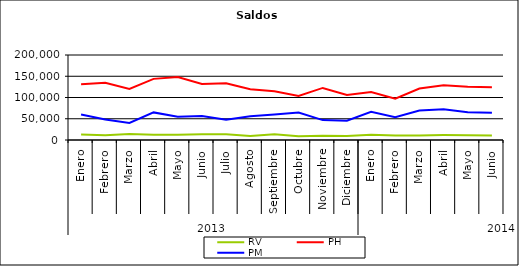
| Category | RV | PH | PM |
|---|---|---|---|
| 0 | 12966.437 | 131380.856 | 59975.653 |
| 1 | 11432.271 | 134655.891 | 48046.612 |
| 2 | 14149.543 | 120343.782 | 40297.909 |
| 3 | 12403.249 | 143830.507 | 64946.114 |
| 4 | 12323.134 | 148139.781 | 54592.514 |
| 5 | 13759.976 | 131634.752 | 56652.701 |
| 6 | 13256.014 | 133515.147 | 47907.561 |
| 7 | 9335.8 | 119600.732 | 55860.576 |
| 8 | 13362.811 | 114843.232 | 59771.51 |
| 9 | 9080.978 | 103607.627 | 64696.186 |
| 10 | 9993.913 | 122533.872 | 46801.148 |
| 11 | 9303.464 | 105747.395 | 45455.331 |
| 12 | 12145.055 | 112918.262 | 66200.17 |
| 13 | 10742.048 | 97242.789 | 53817.215 |
| 14 | 10795.854 | 121097.504 | 69409.543 |
| 15 | 11604.091 | 128798.176 | 72161.549 |
| 16 | 11264.83 | 125268.689 | 65570.493 |
| 17 | 10724.052 | 123922.82 | 64054.99 |